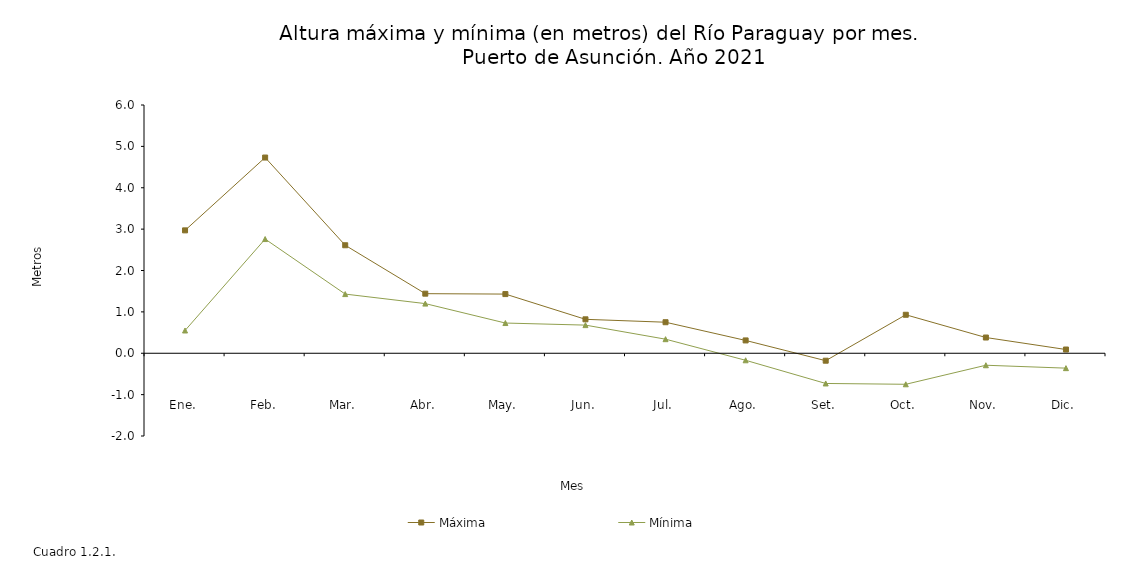
| Category | Máxima | Mínima |
|---|---|---|
| Ene. | 2.97 | 0.55 |
| Feb. | 4.73 | 2.76 |
| Mar. | 2.61 | 1.43 |
| Abr. | 1.44 | 1.2 |
| May. | 1.43 | 0.73 |
| Jun. | 0.82 | 0.68 |
| Jul. | 0.75 | 0.34 |
| Ago. | 0.31 | -0.17 |
| Set. | -0.18 | -0.73 |
| Oct. | 0.93 | -0.75 |
| Nov. | 0.38 | -0.29 |
| Dic. | 0.09 | -0.36 |